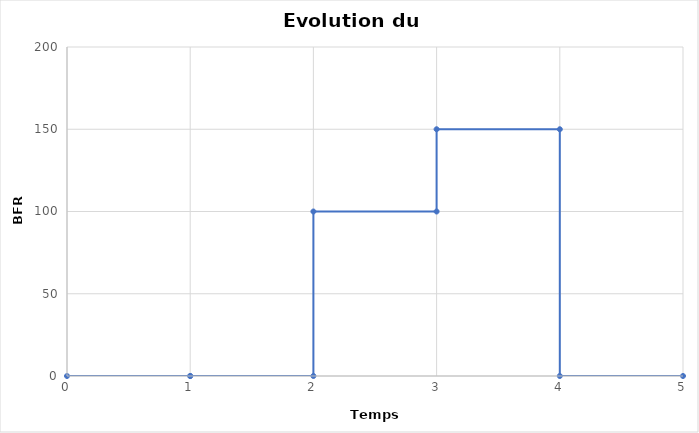
| Category | BFR |
|---|---|
| 0.0 | 0 |
| 1.0 | 0 |
| 1.0 | 0 |
| 2.0 | 0 |
| 2.0 | 100 |
| 3.0 | 100 |
| 3.0 | 150 |
| 4.0 | 150 |
| 4.0 | 0 |
| 5.0 | 0 |